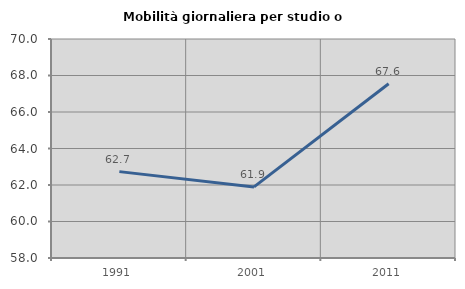
| Category | Mobilità giornaliera per studio o lavoro |
|---|---|
| 1991.0 | 62.733 |
| 2001.0 | 61.896 |
| 2011.0 | 67.551 |